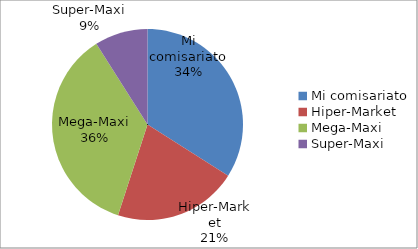
| Category | Series 0 |
|---|---|
| Mi comisariato | 95.2 |
| Hiper-Market | 58.8 |
| Mega-Maxi | 100.8 |
| Super-Maxi | 25.2 |